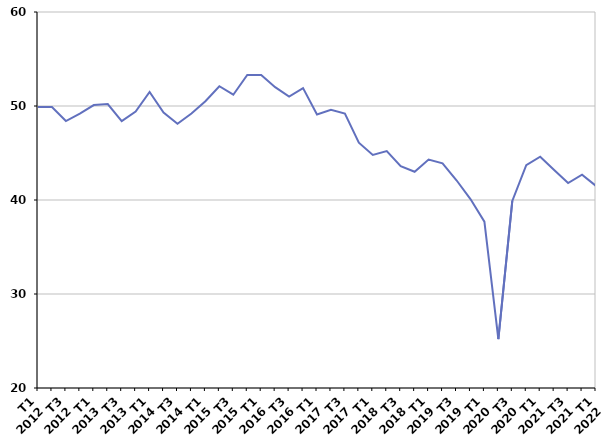
| Category | Autre cas |
|---|---|
| T1
2012 | 49.9 |
| T2
2012 | 49.9 |
| T3
2012 | 48.4 |
| T4
2012 | 49.2 |
| T1
2013 | 50.1 |
| T2
2013 | 50.2 |
| T3
2013 | 48.4 |
| T4
2013 | 49.4 |
| T1
2014 | 51.5 |
| T2
2014 | 49.3 |
| T3
2014 | 48.1 |
| T4
2014 | 49.2 |
| T1
2015 | 50.5 |
| T2
2015 | 52.1 |
| T3
2015 | 51.2 |
| T4
2015 | 53.3 |
| T1
2016 | 53.3 |
| T2
2016 | 52 |
| T3
2016 | 51 |
| T4
2016 | 51.9 |
| T1
2017 | 49.1 |
| T2
2017 | 49.6 |
| T3
2017 | 49.2 |
| T4
2017 | 46.1 |
| T1
2018 | 44.8 |
| T2
2018 | 45.2 |
| T3
2018 | 43.6 |
| T4
2018 | 43 |
| T1
2019 | 44.3 |
| T2
2019 | 43.9 |
| T3
2019 | 42.1 |
| T4
2019 | 40.1 |
| T1
2020 | 37.7 |
| T2
2020 | 25.2 |
| T3
2020 | 39.9 |
| T4
2020 | 43.7 |
| T1
2021 | 44.6 |
| T2
2021 | 43.2 |
| T3
2021 | 41.8 |
| T4
2021 | 42.7 |
| T1
2022 | 41.5 |